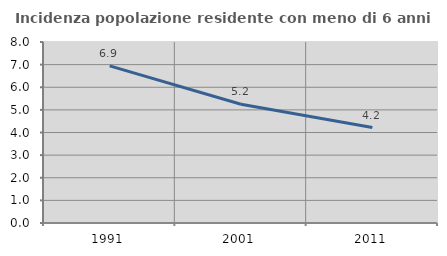
| Category | Incidenza popolazione residente con meno di 6 anni |
|---|---|
| 1991.0 | 6.944 |
| 2001.0 | 5.249 |
| 2011.0 | 4.219 |